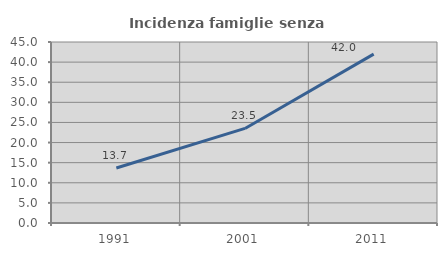
| Category | Incidenza famiglie senza nuclei |
|---|---|
| 1991.0 | 13.672 |
| 2001.0 | 23.51 |
| 2011.0 | 41.974 |